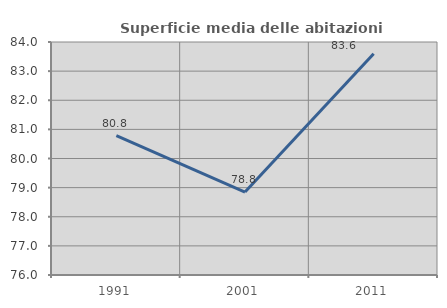
| Category | Superficie media delle abitazioni occupate |
|---|---|
| 1991.0 | 80.786 |
| 2001.0 | 78.848 |
| 2011.0 | 83.595 |